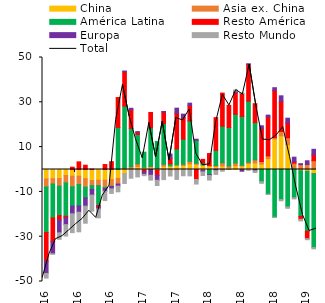
| Category | China | Asia ex. China | América Latina | Resto América | Europa | Resto Mundo |
|---|---|---|---|---|---|---|
| 0 | -4.254 | -3.56 | -20.294 | -12.868 | -5.435 | -2.054 |
| 1900-01-01 | -4.101 | -2.363 | -15.187 | -10.558 | -5.412 | -0.199 |
| 1900-01-02 | -4.031 | -3.381 | -13.182 | -1.951 | -5.724 | -2.887 |
| 1900-01-03 | -2.702 | -3.273 | -14.91 | -0.645 | -3.088 | -5.104 |
| 1900-01-04 | -2.987 | -4.75 | -8.62 | 1.024 | -3.409 | -8.419 |
| 1900-01-05 | -2.993 | -3.693 | -9.563 | 3.411 | -2.832 | -8.742 |
| 1900-01-06 | -4.119 | -3.787 | -4.748 | 1.91 | -3.72 | -7.601 |
| 1900-01-07 | -4.957 | -2.26 | -1.631 | 0.171 | -2.591 | -7.135 |
| 1900-01-08 | -4.819 | -2.369 | -8.892 | -0.757 | -0.796 | -3.951 |
| 1900-01-09 | -4.774 | -3.201 | -0.587 | 2.216 | -1.19 | -4.119 |
| 1900-01-10 | -4.525 | -2.921 | -0.139 | 3.492 | -1.071 | -2.005 |
| 1900-01-11 | -4.005 | -2.49 | 18.8 | 13.315 | -0.925 | -2.545 |
| 1900-01-12 | -1.798 | 0.681 | 27.646 | 15.294 | 0.347 | -4.419 |
| 1900-01-13 | 0.446 | 0.799 | 17.102 | 8.264 | 0.721 | -3.893 |
| 1900-01-14 | 1.354 | 1.189 | 13.097 | 0.997 | 0.273 | -3.313 |
| 1900-01-15 | 0.965 | -0.279 | 6.775 | -0.698 | -1.215 | -0.565 |
| 1900-01-16 | 1.113 | 0.254 | 17.217 | 6.878 | -2.572 | -2.154 |
| 1900-01-17 | 0.56 | -0.411 | 11.972 | -2.165 | -2.247 | -2.32 |
| 1900-01-18 | 1.505 | 0.83 | 18.131 | 5.167 | 0.27 | -4.51 |
| 1900-01-19 | 1.576 | -0.399 | 0.958 | 2.547 | 1.802 | -2.495 |
| 1900-01-20 | 1.981 | -0.202 | 7.205 | 15.904 | 2.292 | -4.209 |
| 1900-01-21 | 1.772 | 0.573 | 11.197 | 9.48 | 1.682 | -2.796 |
| 1900-01-22 | 2.538 | 1.13 | 18.025 | 6.881 | 1.04 | -2.835 |
| 1900-01-23 | 2.293 | 0.505 | 10.184 | -4.468 | 0.551 | -2.032 |
| 1900-01-24 | 2.004 | -0.492 | 0.92 | 1.617 | -0.565 | -1.618 |
| 1900-01-25 | 1.676 | 0.005 | -2.288 | 5.435 | -0.401 | -2.029 |
| 1900-01-26 | 1.375 | 0.387 | 6.792 | 14.594 | -0.517 | -1.677 |
| 1900-01-27 | 1.631 | 1.384 | 16.307 | 14.778 | -0.158 | -0.613 |
| 1900-01-28 | 0.839 | 0.716 | 17.23 | 9.851 | -0.003 | -0.032 |
| 1900-01-29 | 1.745 | 1.152 | 21.753 | 9.611 | 0.749 | 0.486 |
| 1900-01-30 | 1.561 | 0.325 | 21.799 | 10.252 | -0.769 | 0.295 |
| 1900-01-31 | 2.687 | 0.602 | 27.206 | 16.357 | 0.363 | -0.364 |
| 1900-02-01 | 2.946 | 1.341 | 16.632 | 8.473 | -0.612 | -0.737 |
| 1900-02-02 | 2.438 | 1.125 | -5.443 | 14.635 | 1.318 | -0.721 |
| 1900-02-03 | 4.844 | 1.235 | -11.036 | 17.422 | 0.779 | -0.138 |
| 1900-02-04 | 13.611 | 0.611 | -21.325 | 21.034 | 1.259 | -0.077 |
| 1900-02-05 | 15.039 | 1.932 | -13.431 | 13.433 | 2.488 | -0.549 |
| 1900-02-06 | 11.164 | 3.005 | -16.682 | 6.61 | 2.118 | -0.64 |
| 1900-02-07 | 0.368 | 2.47 | -12.621 | 0.645 | 2.014 | -0.521 |
| 1900-02-08 | -0.547 | 2.169 | -20.359 | -1.322 | 0.44 | -0.716 |
| 1900-02-09 | -0.764 | 2.216 | -26.758 | -3.359 | 1.681 | -0.467 |
| 1900-02-10 | -1.811 | 3.914 | -33.046 | 2.631 | 2.471 | -0.572 |